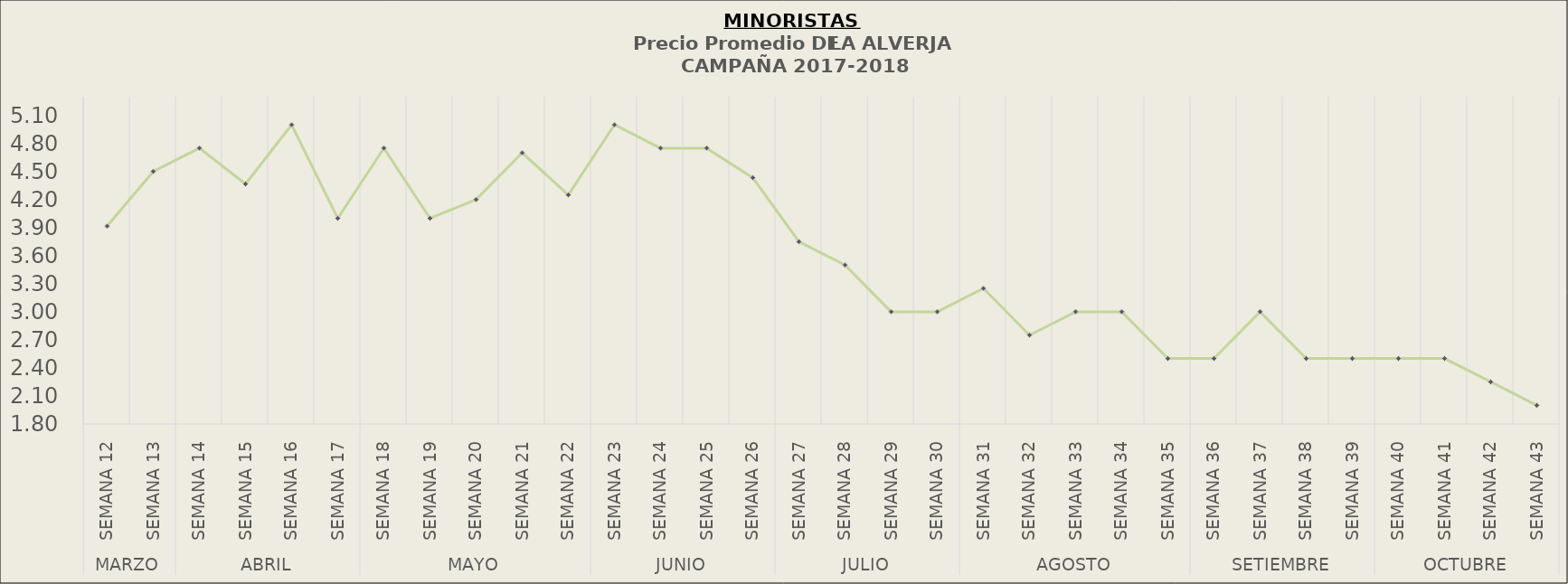
| Category | Precio Promedio ( S/.x Kg.) |
|---|---|
| 0 | 3.917 |
| 1 | 4.5 |
| 2 | 4.75 |
| 3 | 4.367 |
| 4 | 5 |
| 5 | 4 |
| 6 | 4.75 |
| 7 | 4 |
| 8 | 4.2 |
| 9 | 4.7 |
| 10 | 4.25 |
| 11 | 5 |
| 12 | 4.75 |
| 13 | 4.75 |
| 14 | 4.433 |
| 15 | 3.75 |
| 16 | 3.5 |
| 17 | 3 |
| 18 | 3 |
| 19 | 3.25 |
| 20 | 2.75 |
| 21 | 3 |
| 22 | 3 |
| 23 | 2.5 |
| 24 | 2.5 |
| 25 | 3 |
| 26 | 2.5 |
| 27 | 2.5 |
| 28 | 2.5 |
| 29 | 2.5 |
| 30 | 2.25 |
| 31 | 2 |